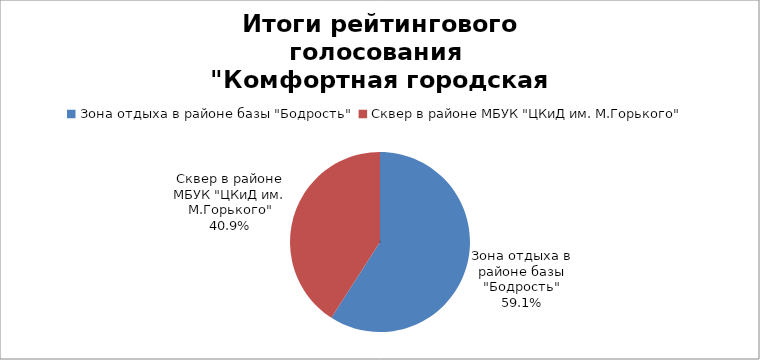
| Category | Series 0 |
|---|---|
| Зона отдыха в районе базы "Бодрость" | 9834 |
| Сквер в районе МБУК "ЦКиД им. М.Горького" | 6808 |